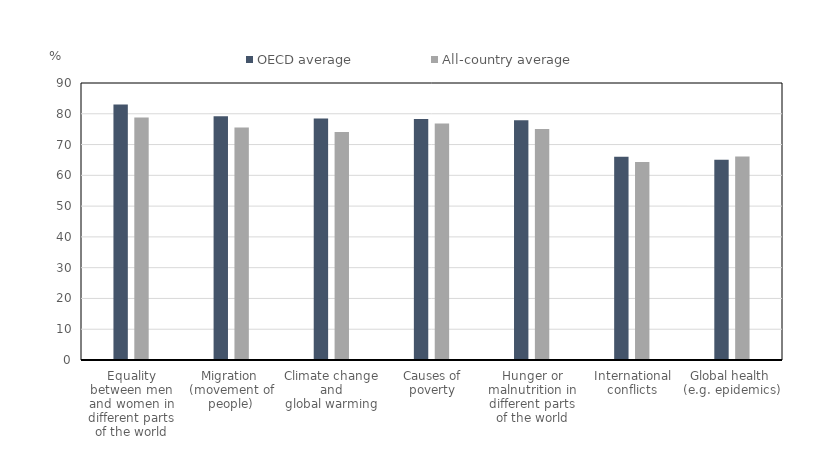
| Category | OECD average | All-country average |
|---|---|---|
| Equality between men and women in
different parts of the world | 82.985 | 78.783 |
| Migration 
(movement of people) | 79.164 | 75.55 |
| Climate change and
global warming | 78.481 | 74.05 |
| Causes of poverty | 78.304 | 76.861 |
| Hunger or malnutrition in
different parts of the world | 77.911 | 75.034 |
| International conflicts | 66.062 | 64.367 |
| Global health 
(e.g. epidemics) | 65.067 | 66.129 |